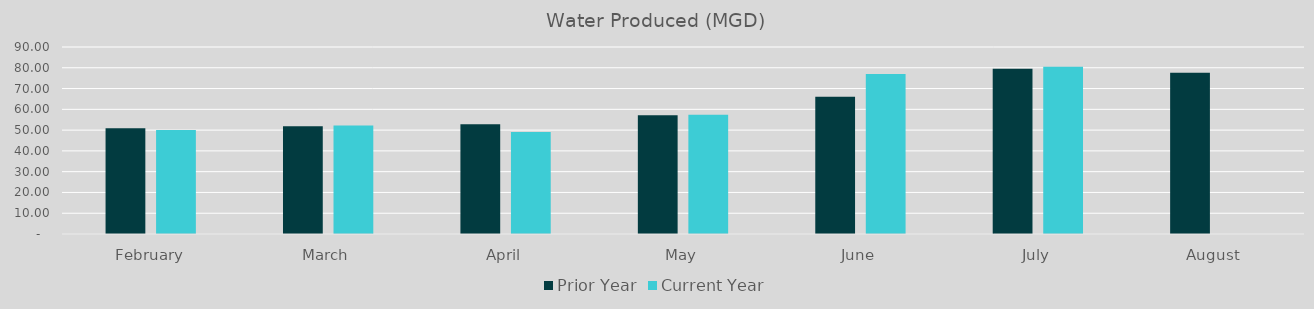
| Category | Prior Year | Current Year |
|---|---|---|
| February | 50.84 | 50.11 |
| March | 51.85 | 52.27 |
| April | 52.78 | 49.07 |
| May | 57.16 | 57.41 |
| June | 66.11 | 77.05 |
| July | 79.53 | 80.48 |
| August | 77.55 | 0 |